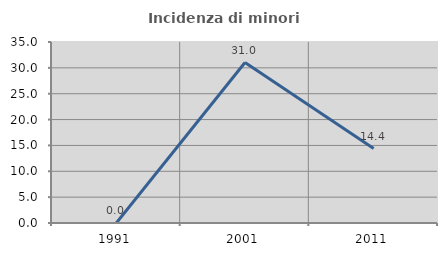
| Category | Incidenza di minori stranieri |
|---|---|
| 1991.0 | 0 |
| 2001.0 | 31.034 |
| 2011.0 | 14.384 |